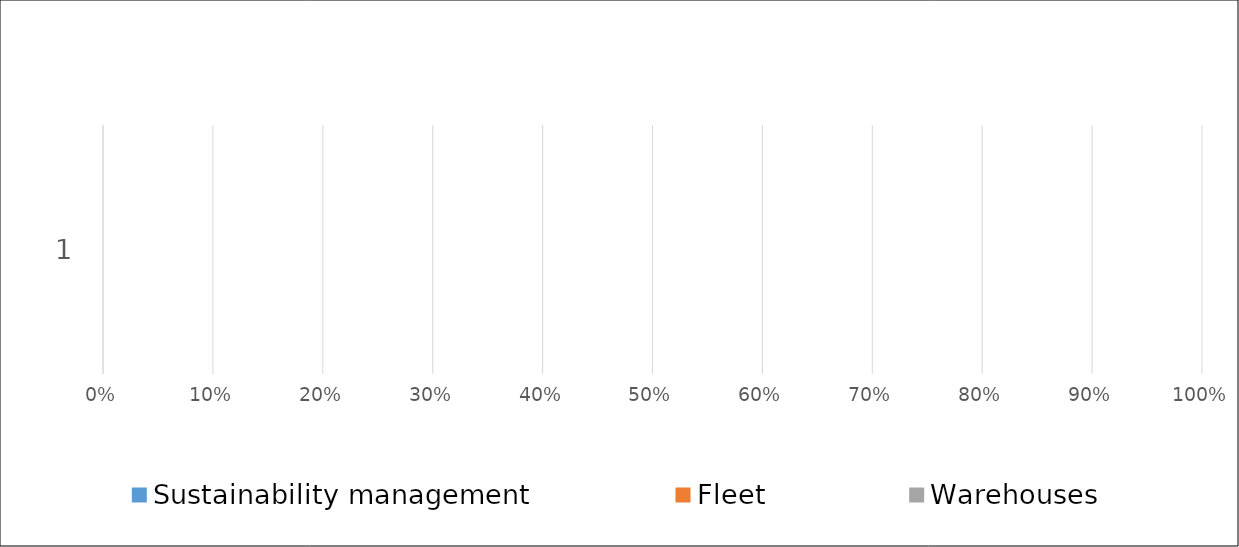
| Category | Sustainability management  | Fleet | Warehouses |
|---|---|---|---|
| 0 | 0 | 0 | 0 |